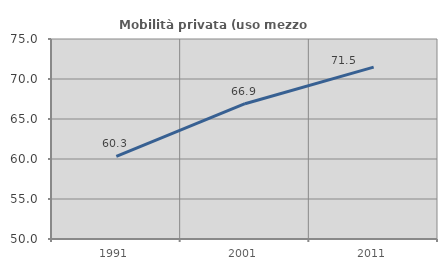
| Category | Mobilità privata (uso mezzo privato) |
|---|---|
| 1991.0 | 60.335 |
| 2001.0 | 66.913 |
| 2011.0 | 71.48 |